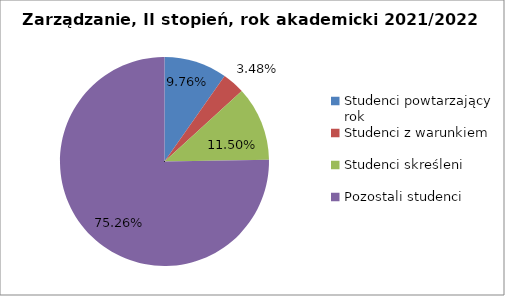
| Category | Series 0 |
|---|---|
| Studenci powtarzający rok | 28 |
| Studenci z warunkiem | 10 |
| Studenci skreśleni | 33 |
| Pozostali studenci | 216 |